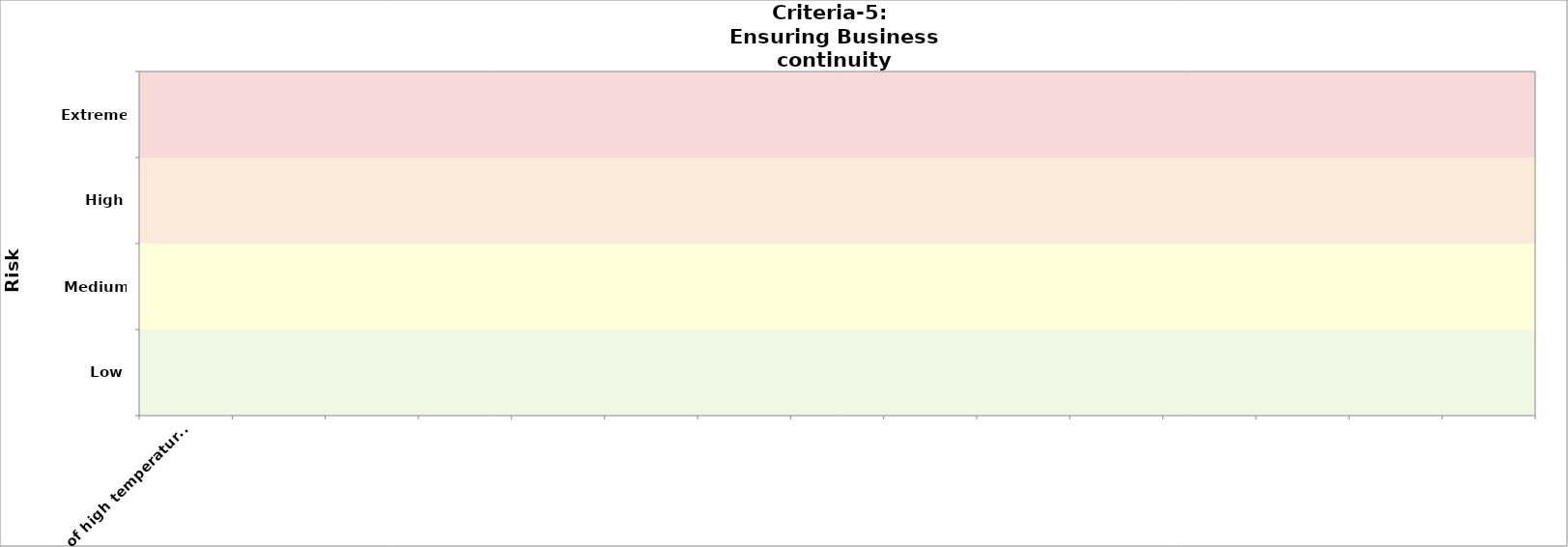
| Category | Criteria-3 (public health) | Criteria-5 
2030 |
|---|---|---|
| e.g. effect of high temperature on road pavement  |  | 0 |